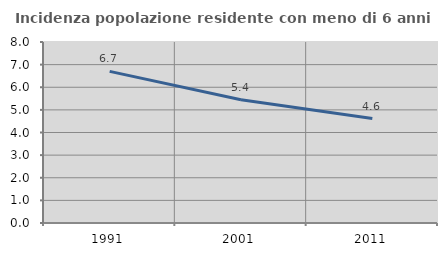
| Category | Incidenza popolazione residente con meno di 6 anni |
|---|---|
| 1991.0 | 6.702 |
| 2001.0 | 5.446 |
| 2011.0 | 4.615 |